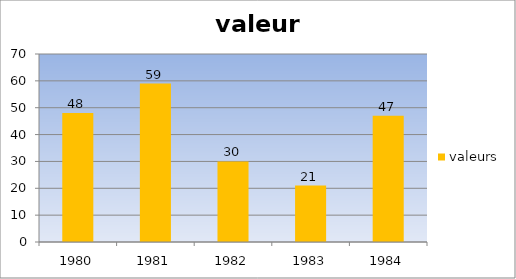
| Category | valeurs |
|---|---|
| 1980.0 | 48 |
| 1981.0 | 59 |
| 1982.0 | 30 |
| 1983.0 | 21 |
| 1984.0 | 47 |